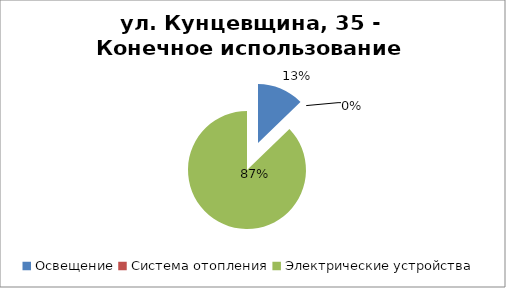
| Category | Series 0 |
|---|---|
| Освещение | 444.626 |
| Система отопления | 0 |
| Электрические устройства | 3036.134 |